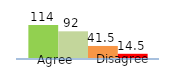
| Category | Series 0 | Series 1 | Series 2 | Series 3 |
|---|---|---|---|---|
| 0 | 114 | 92 | 41.5 | 14.5 |